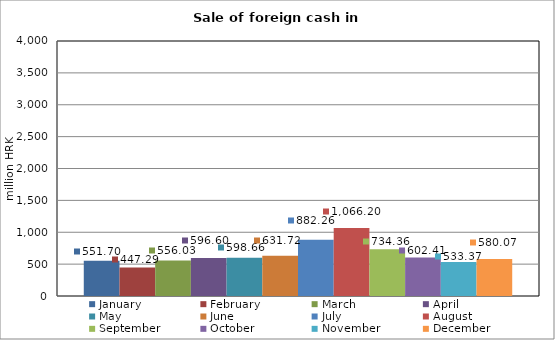
| Category | January | February | March | April | May | June | July | August | September | October | November | December |
|---|---|---|---|---|---|---|---|---|---|---|---|---|
| 0 | 551.698 | 447.287 | 556.034 | 596.603 | 598.658 | 631.723 | 882.263 | 1066.196 | 734.356 | 602.412 | 533.366 | 580.067 |